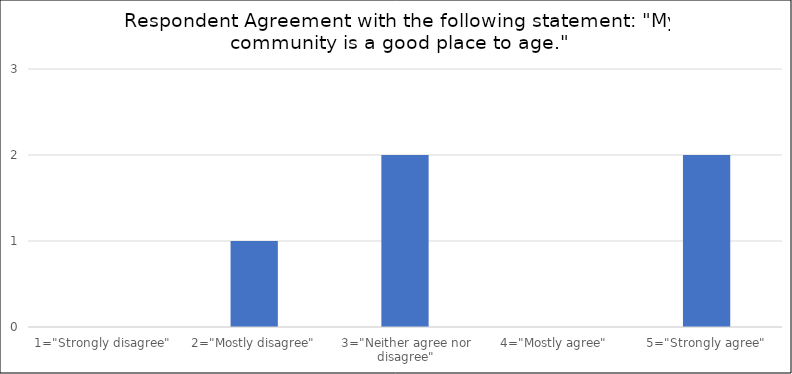
| Category | Number of Responses |
|---|---|
| 1="Strongly disagree" | 0 |
| 2="Mostly disagree" | 1 |
| 3="Neither agree nor disagree" | 2 |
| 4="Mostly agree" | 0 |
| 5="Strongly agree" | 2 |